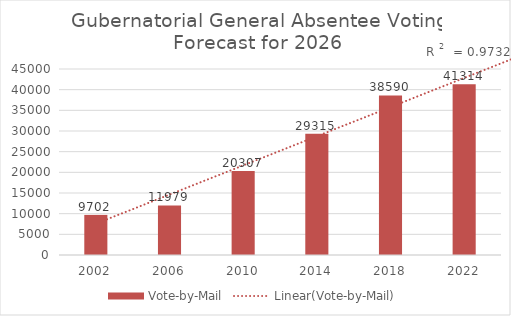
| Category | Vote-by-Mail |
|---|---|
| 2002.0 | 9702 |
| 2006.0 | 11979 |
| 2010.0 | 20307 |
| 2014.0 | 29315 |
| 2018.0 | 38590 |
| 2022.0 | 41314 |